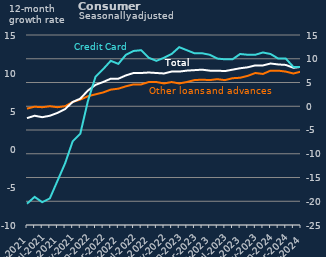
| Category | Other loans and advances | Total |
|---|---|---|
| May-2021 | -0.5 | -2.5 |
| Jun-2021 | -0.1 | -2 |
| Jul-2021 | -0.2 | -2.3 |
| Aug-2021 | 0 | -2 |
| Sep-2021 | -0.2 | -1.4 |
| Oct-2021 | 0 | -0.6 |
| Nov-2021 | 0.9 | 0.9 |
| Dec-2021 | 1.4 | 1.6 |
| Jan-2022 | 2.1 | 3.3 |
| Feb-2022 | 2.5 | 4.5 |
| Mar-2022 | 2.9 | 5.1 |
| Apr-2022 | 3.5 | 5.8 |
| May-2022 | 3.7 | 5.8 |
| Jun-2022 | 4.2 | 6.5 |
| Jul-2022 | 4.6 | 7 |
| Aug-2022 | 4.6 | 7 |
| Sep-2022 | 5.1 | 7.1 |
| Oct-2022 | 5.1 | 7 |
| Nov-2022 | 4.8 | 6.9 |
| Dec-2022 | 5.1 | 7.3 |
| Jan-2023 | 4.8 | 7.3 |
| Feb-2023 | 5.1 | 7.5 |
| Mar-2023 | 5.5 | 7.6 |
| Apr-2023 | 5.6 | 7.7 |
| May-2023 | 5.5 | 7.5 |
| Jun-2023 | 5.7 | 7.5 |
| Jul-2023 | 5.5 | 7.4 |
| Aug-2023 | 5.9 | 7.7 |
| Sep-2023 | 6 | 8 |
| Oct-2023 | 6.4 | 8.2 |
| Nov-2023 | 7 | 8.6 |
| Dec-2023 | 6.8 | 8.6 |
| Jan-2024 | 7.5 | 9 |
| Feb-2024 | 7.5 | 8.8 |
| Mar-2024 | 7.3 | 8.7 |
| Apr-2024 | 6.9 | 8.1 |
| May-2024 | 7.3 | 8.3 |